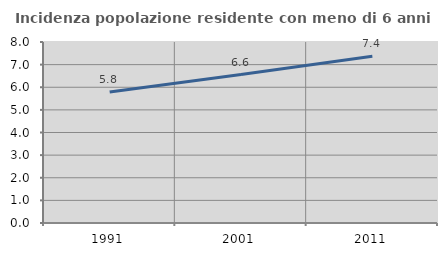
| Category | Incidenza popolazione residente con meno di 6 anni |
|---|---|
| 1991.0 | 5.786 |
| 2001.0 | 6.563 |
| 2011.0 | 7.37 |